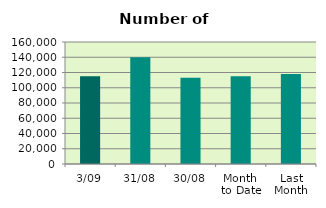
| Category | Series 0 |
|---|---|
| 3/09 | 115016 |
| 31/08 | 140124 |
| 30/08 | 113030 |
| Month 
to Date | 115016 |
| Last
Month | 118077.217 |